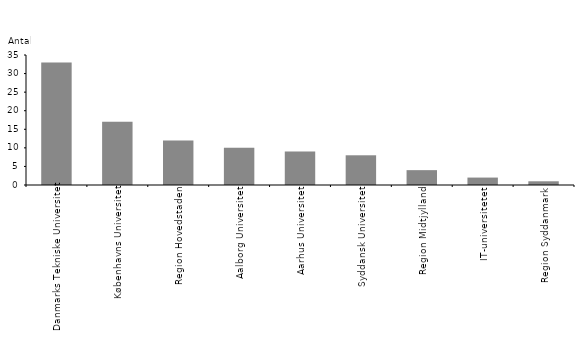
| Category | Series 0 |
|---|---|
| Danmarks Tekniske Universitet | 33 |
| Københavns Universitet | 17 |
| Region Hovedstaden | 12 |
| Aalborg Universitet | 10 |
| Aarhus Universitet | 9 |
| Syddansk Universitet | 8 |
| Region Midtjylland | 4 |
| IT-universitetet | 2 |
| Region Syddanmark | 1 |